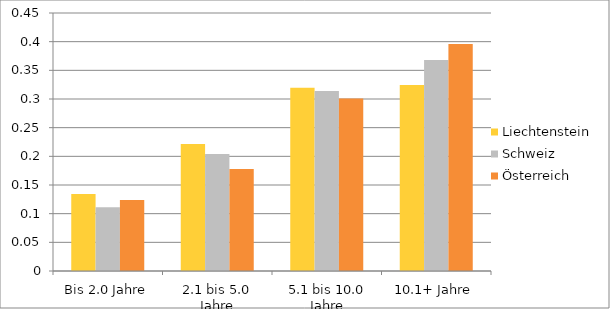
| Category | Liechtenstein | Schweiz | Österreich |
|---|---|---|---|
| Bis 2.0 Jahre | 0.134 | 0.111 | 0.124 |
| 2.1 bis 5.0 Jahre | 0.222 | 0.204 | 0.178 |
| 5.1 bis 10.0 Jahre | 0.319 | 0.314 | 0.301 |
| 10.1+ Jahre | 0.324 | 0.368 | 0.396 |